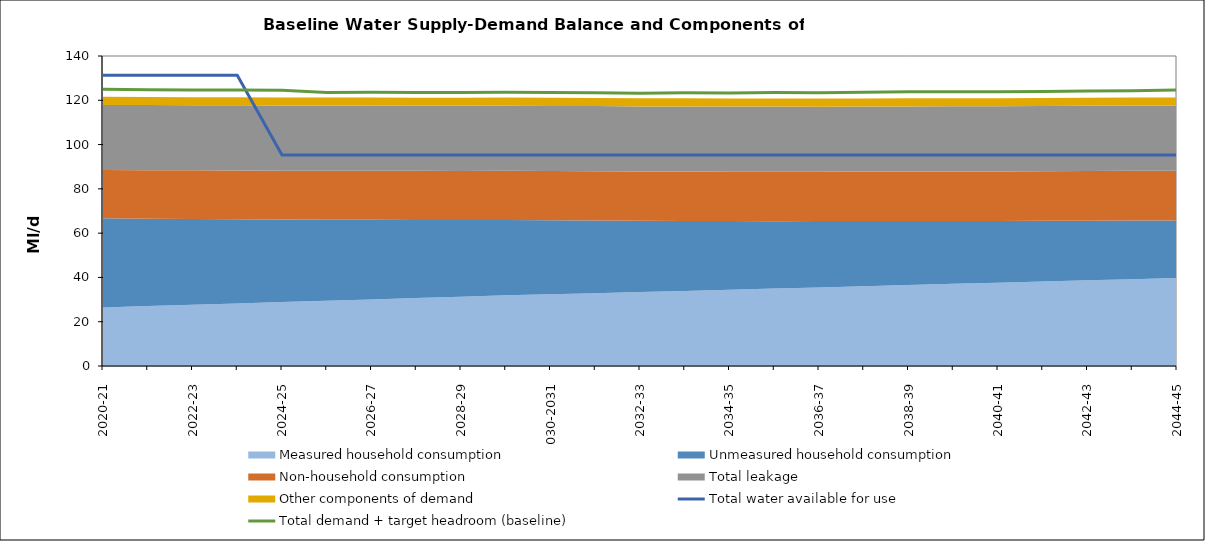
| Category | Total water available for use | Total demand + target headroom (baseline) |
|---|---|---|
| 0 | 131.269 | 125.031 |
| 1 | 131.269 | 124.794 |
| 2 | 131.269 | 124.681 |
| 3 | 131.269 | 124.59 |
| 4 | 95.269 | 124.58 |
| 5 | 95.269 | 123.547 |
| 6 | 95.269 | 123.588 |
| 7 | 95.269 | 123.567 |
| 8 | 95.269 | 123.507 |
| 9 | 95.269 | 123.577 |
| 10 | 95.269 | 123.488 |
| 11 | 95.269 | 123.447 |
| 12 | 95.269 | 123.207 |
| 13 | 95.269 | 123.383 |
| 14 | 95.269 | 123.324 |
| 15 | 95.269 | 123.493 |
| 16 | 95.269 | 123.458 |
| 17 | 95.269 | 123.662 |
| 18 | 95.269 | 123.87 |
| 19 | 95.269 | 123.866 |
| 20 | 95.269 | 123.838 |
| 21 | 95.269 | 123.936 |
| 22 | 95.269 | 124.157 |
| 23 | 95.269 | 124.302 |
| 24 | 95.269 | 124.604 |